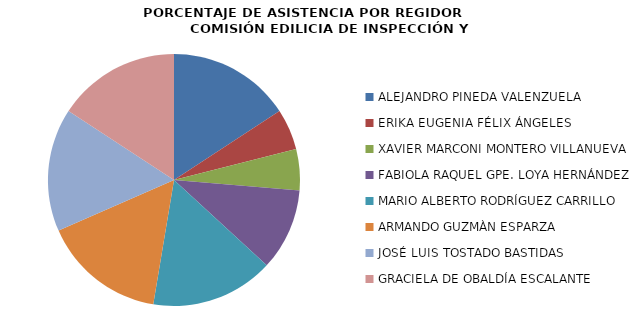
| Category | Series 0 |
|---|---|
| ALEJANDRO PINEDA VALENZUELA | 100 |
| ERIKA EUGENIA FÉLIX ÁNGELES | 33.333 |
| XAVIER MARCONI MONTERO VILLANUEVA | 33.333 |
| FABIOLA RAQUEL GPE. LOYA HERNÁNDEZ | 66.667 |
| MARIO ALBERTO RODRÍGUEZ CARRILLO | 100 |
| ARMANDO GUZMÀN ESPARZA | 100 |
| JOSÉ LUIS TOSTADO BASTIDAS | 100 |
| GRACIELA DE OBALDÍA ESCALANTE | 100 |